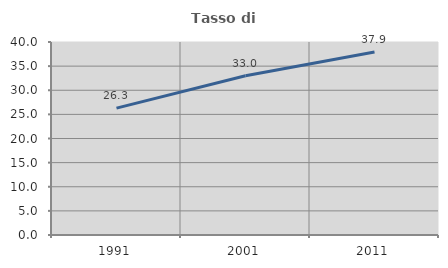
| Category | Tasso di occupazione   |
|---|---|
| 1991.0 | 26.297 |
| 2001.0 | 33.016 |
| 2011.0 | 37.938 |